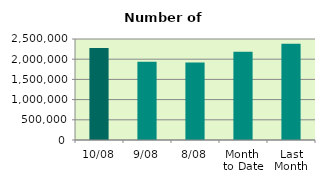
| Category | Series 0 |
|---|---|
| 10/08 | 2274284 |
| 9/08 | 1935442 |
| 8/08 | 1920002 |
| Month 
to Date | 2181585 |
| Last
Month | 2380266.19 |